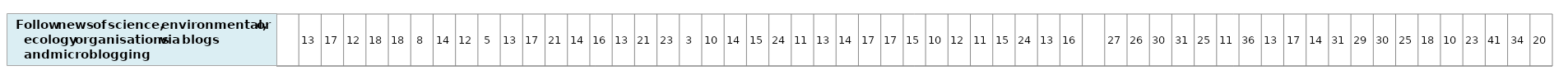
| Category | Follow news of science, environmental, or ecology organisations via blogs and microblogging |
|---|---|
| nan | 1 |
| 12.88220713524121 | 1 |
| 17.49809735068936 | 1 |
| 12.42627351741398 | 1 |
| 17.59693490780501 | 1 |
| 18.13563065905627 | 1 |
| 7.788063681276666 | 1 |
| 14.06989272871714 | 1 |
| 12.08425744494906 | 1 |
| 4.693364741661258 | 1 |
| 13.14239754544558 | 1 |
| 16.58228196507054 | 1 |
| 21.32767161080055 | 1 |
| 14.49518908031008 | 1 |
| 16.28103205448765 | 1 |
| 13.07597219473969 | 1 |
| 21.3852134306459 | 1 |
| 23.34424044771936 | 1 |
| 2.968821922885526 | 1 |
| 10.02268380206473 | 1 |
| 13.69619779127975 | 1 |
| 14.62702587416037 | 1 |
| 24.26021298376792 | 1 |
| 11.069353338747 | 1 |
| 12.73729625140568 | 1 |
| 14.38992807712403 | 1 |
| 16.74385145250463 | 1 |
| 16.91794889723952 | 1 |
| 14.81427415478234 | 1 |
| 9.692979151157049 | 1 |
| 12.22138428819582 | 1 |
| 11.2302052495638 | 1 |
| 14.83705351156447 | 1 |
| 24.3322335122201 | 1 |
| 13.02320506941245 | 1 |
| 15.6724958991786 | 1 |
| nan | 1 |
| 26.77693833156014 | 1 |
| 25.89831579713764 | 1 |
| 29.92951491616499 | 1 |
| 30.96460395698038 | 1 |
| 24.85883088477881 | 1 |
| 10.62238577772011 | 1 |
| 36.07016913540592 | 1 |
| 12.86912916702116 | 1 |
| 17.45671730801452 | 1 |
| 13.90076000329175 | 1 |
| 31.30664323144232 | 1 |
| 28.66314502039302 | 1 |
| 30.00673525151731 | 1 |
| 25.40219816815183 | 1 |
| 18.10232760081065 | 1 |
| 9.758486038673633 | 1 |
| 22.79397647467827 | 1 |
| 40.54041668087752 | 1 |
| 34.05723578069385 | 1 |
| 20.31383174445664 | 1 |